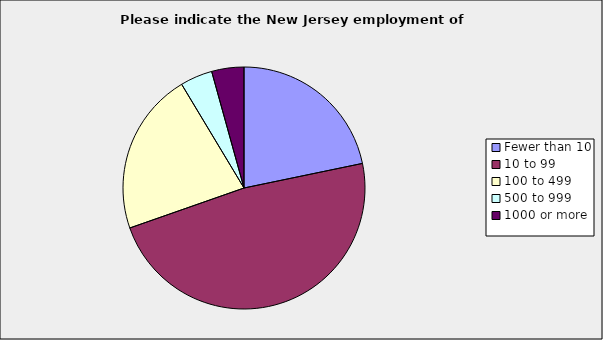
| Category | Series 0 |
|---|---|
| Fewer than 10 | 0.217 |
| 10 to 99 | 0.478 |
| 100 to 499 | 0.217 |
| 500 to 999 | 0.043 |
| 1000 or more | 0.043 |